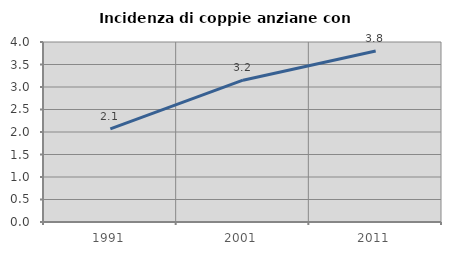
| Category | Incidenza di coppie anziane con figli |
|---|---|
| 1991.0 | 2.071 |
| 2001.0 | 3.151 |
| 2011.0 | 3.801 |